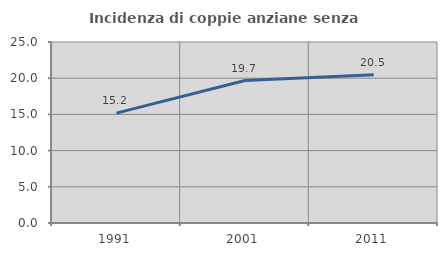
| Category | Incidenza di coppie anziane senza figli  |
|---|---|
| 1991.0 | 15.176 |
| 2001.0 | 19.677 |
| 2011.0 | 20.482 |